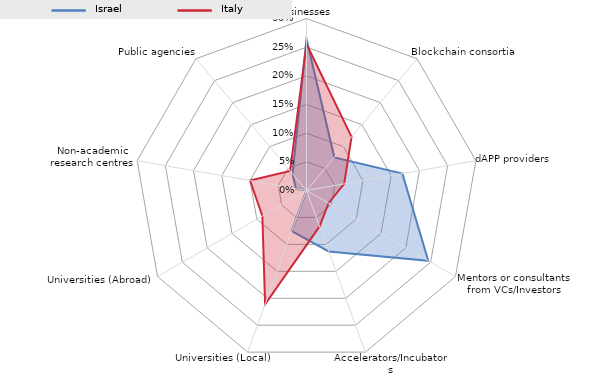
| Category | Series 0 | Series 1 |
|---|---|---|
| Businesses | 0.264 | 0.256 |
| Blockchain consortia | 0.075 | 0.122 |
| dAPP providers | 0.17 | 0.067 |
| Mentors or consultants from VCs/Investors | 0.245 | 0.044 |
| Accelerators/Incubators | 0.113 | 0.067 |
| Universities (Local) | 0.075 | 0.211 |
| Universities (Abroad) | 0 | 0.089 |
| Non-academic research centres | 0.019 | 0.1 |
| Public agencies | 0.038 | 0.044 |